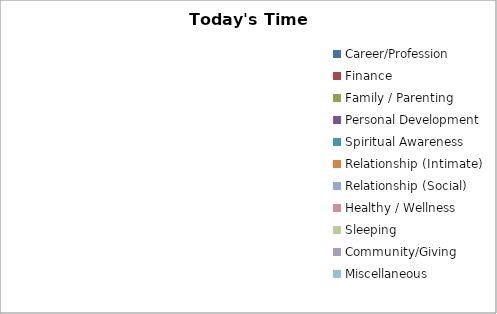
| Category | Series 1 | Series 0 |
|---|---|---|
| Career/Profession | 0 | 0 |
| Finance | 0 | 0 |
| Family / Parenting | 0 | 0 |
| Personal Development | 0 | 0 |
| Spiritual Awareness | 0 | 0 |
| Relationship (Intimate) | 0 | 0 |
| Relationship (Social) | 0 | 0 |
| Healthy / Wellness | 0 | 0 |
| Sleeping | 0 | 0 |
| Community/Giving | 0 | 0 |
| Miscellaneous | 0 | 0 |